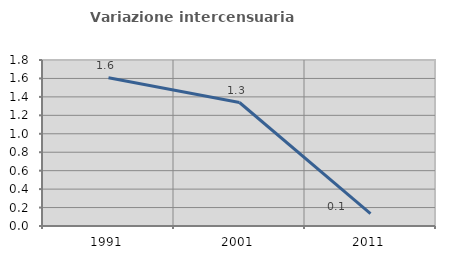
| Category | Variazione intercensuaria annua |
|---|---|
| 1991.0 | 1.607 |
| 2001.0 | 1.339 |
| 2011.0 | 0.134 |